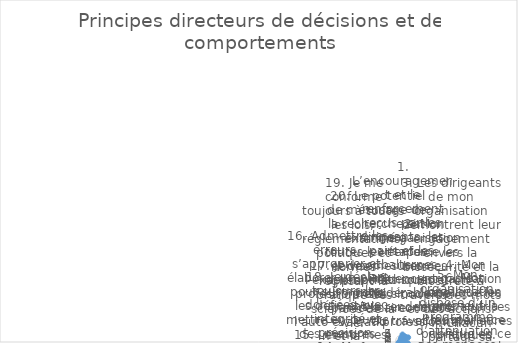
| Category | Series 0 |
|---|---|
| 1. L’encouragement et le renforcement reçus par les dirigeants, les pairs et les subalternes influencent considérablement le rendement au travail. | 5 |
| 2. Mon organisation renforce les normes éthiques et un code de conduite professionnel. | 4 |
| 3. Les dirigeants de mon organisation démontrent leur engagement envers la biosécurité et la biosûreté à travers des mots et des actions. | 4 |
| 4. Mon organisation applique les leçons apprises et les meilleures pratiques. | 5 |
| 5. Mon organisation dispose d’un programme d’atténuation des menaces internes. | 1 |
| 6. Mon organisation promeut la transparence publique en ce qui concerne sa conformité aux exigences de biosécurité et de biosûreté. | 2 |
| 7. Chacun partage sa responsabilité personnelle en matière de de biosécurité et de biosûreté. | 4 |
| 8. Je connais le concept et les implications de la recherche préoccupante à double usage. | 2 |
| 9. Des personnes dûment qualifiées et formées assurent la surveillance de la biosécurité et de la biosûreté. | 2 |
| 10. Lorsqu’un incident ou un quasi-accident se produit, les gens procèdent à un remue-méninge au lieu de se blâmer. La question posée est « qu’est-ce qui a mal tourné ? » pas « qui avait tort ? », en se concentrant sur l’amélioration, pas sur le blâme. | 5 |
| 11. Je considère les implications et les applications possibles de mon travail et l’équilibre entre la recherche de connaissances scientifiques et mes responsabilités éthiques envers la société. | 3 |
| 12. Je suis motivé pour minimiser les risques de mésusage de la science pour la société. | 0 |
| 13. Je suis conscient de la menace du bioterrorisme et des armes biologiques. | 1 |
| 14. Mon organisation a mis en place un code de conduite responsable. | 2 |
| 15. Les normes sont appliquées dans mon organisation. | 3 |
| 16. Admettre les erreurs, s’approprier et élaborer un plan pour surmonter les défis et/ou mettre en œuvre des mesures correctives font partie intégrante d’une biosécurité et d’une biosûreté efficaces. | 2 |
| 17. Je vise l’excellence professionnelle par l’auto-évaluation et la formation continue. | 1 |
| 18. Je déclare toujours les données avec intégrité et précision. | 0 |
| 19. Je me conforme toujours à toutes les lois, réglementations, politiques et normes régissant la pratique des sciences de la vie. | 2 |
| 20. Le potentiel de mésusage de la recherche est examiné à toutes les étapes et des mesures appropriées sont prises si nécessaire. | 3 |